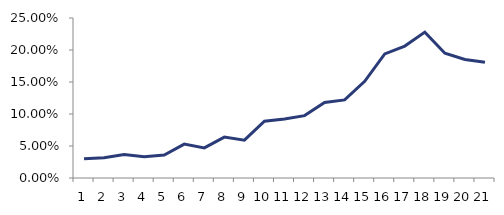
| Category | Short Rate |
|---|---|
| 0 | 0.03 |
| 1 | 0.032 |
| 2 | 0.037 |
| 3 | 0.033 |
| 4 | 0.036 |
| 5 | 0.053 |
| 6 | 0.047 |
| 7 | 0.064 |
| 8 | 0.059 |
| 9 | 0.089 |
| 10 | 0.092 |
| 11 | 0.097 |
| 12 | 0.118 |
| 13 | 0.122 |
| 14 | 0.151 |
| 15 | 0.194 |
| 16 | 0.206 |
| 17 | 0.228 |
| 18 | 0.195 |
| 19 | 0.185 |
| 20 | 0.181 |